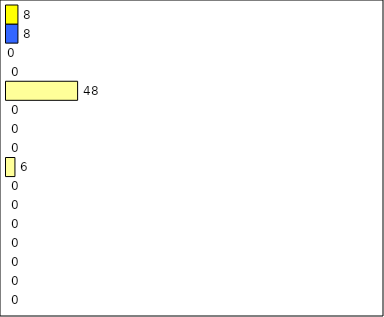
| Category | -2 | -1 | 0 | 1 | 2 | 3 | 4 | 5 | 6 | 7 | 8 | 9 | 10 | 11 | 12 | Perfect Round |
|---|---|---|---|---|---|---|---|---|---|---|---|---|---|---|---|---|
| 0 | 0 | 0 | 0 | 0 | 0 | 0 | 0 | 6 | 0 | 0 | 0 | 48 | 0 | 0 | 8 | 8 |